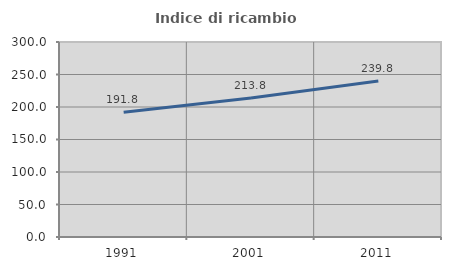
| Category | Indice di ricambio occupazionale  |
|---|---|
| 1991.0 | 191.843 |
| 2001.0 | 213.821 |
| 2011.0 | 239.844 |